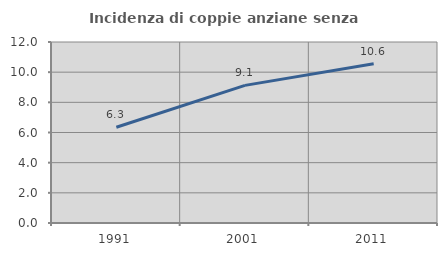
| Category | Incidenza di coppie anziane senza figli  |
|---|---|
| 1991.0 | 6.346 |
| 2001.0 | 9.124 |
| 2011.0 | 10.555 |